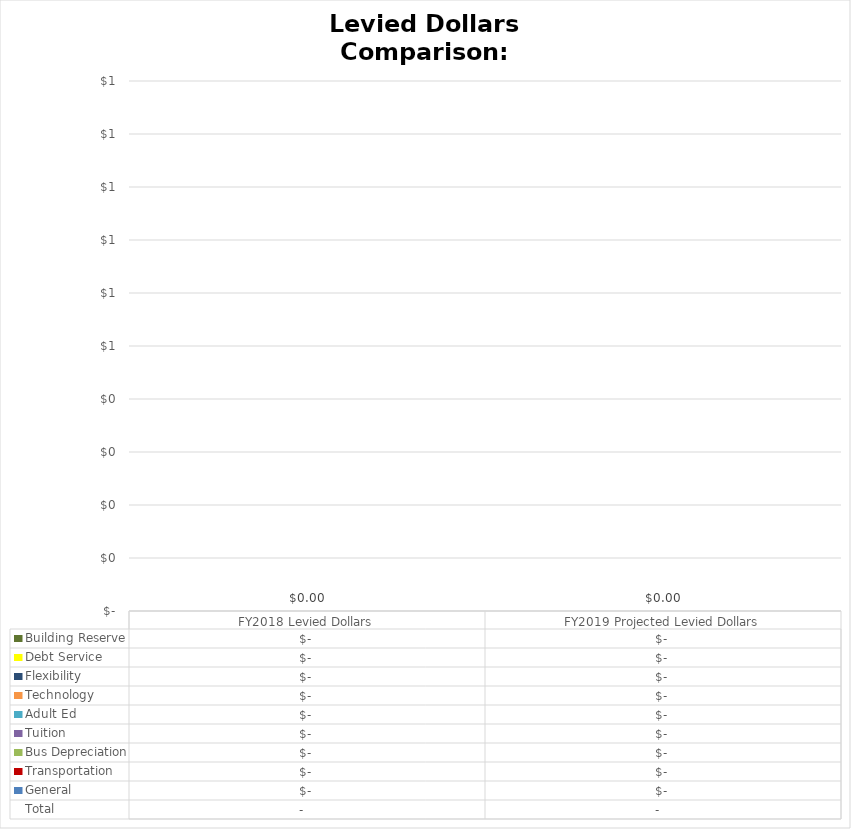
| Category | General | Transportation | Bus Depreciation | Tuition | Adult Ed | Technology | Flexibility | Debt Service | Building Reserve |
|---|---|---|---|---|---|---|---|---|---|
| FY2018 Levied Dollars | 0 | 0 | 0 | 0 | 0 | 0 | 0 | 0 | 0 |
| FY2019 Projected Levied Dollars | 0 | 0 | 0 | 0 | 0 | 0 | 0 | 0 | 0 |